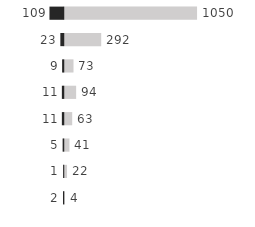
| Category | Series 0 | Series 1 |
|---|---|---|
| 0 | 1050 | -109 |
| 1 | 292 | -23 |
| 2 | 73 | -9 |
| 3 | 94 | -11 |
| 4 | 63 | -11 |
| 5 | 41 | -5 |
| 6 | 22 | -1 |
| 7 | 4 | -2 |